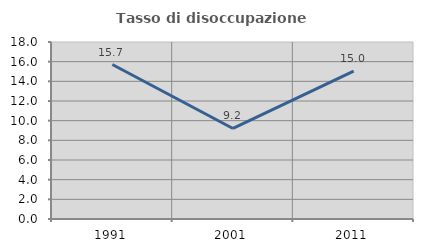
| Category | Tasso di disoccupazione giovanile  |
|---|---|
| 1991.0 | 15.709 |
| 2001.0 | 9.207 |
| 2011.0 | 15.04 |